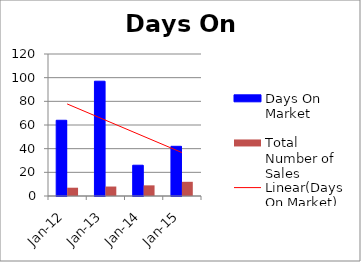
| Category | Days On Market | Total Number of Sales |
|---|---|---|
| 2012-01-01 | 64 | 7 |
| 2013-01-01 | 97 | 8 |
| 2014-01-01 | 26 | 9 |
| 2015-01-01 | 42 | 12 |